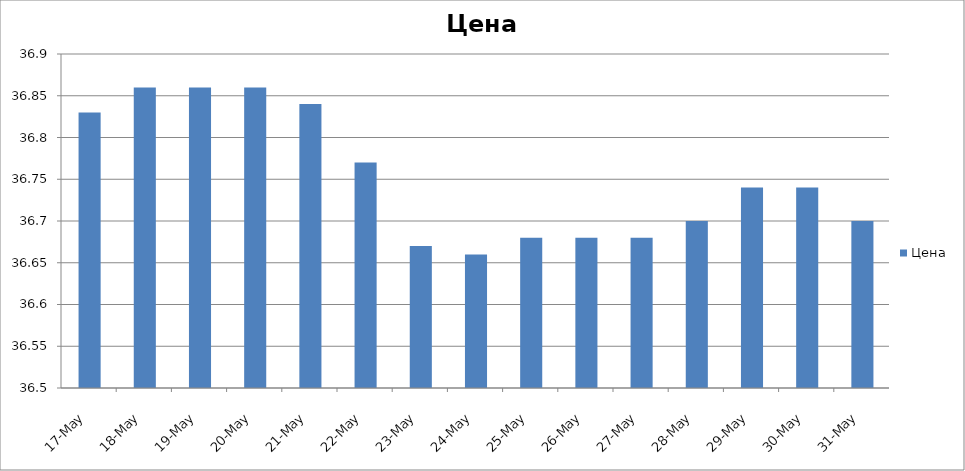
| Category | Цена |
|---|---|
| 2018-05-17 | 36.83 |
| 2018-05-18 | 36.86 |
| 2018-05-19 | 36.86 |
| 2018-05-20 | 36.86 |
| 2018-05-21 | 36.84 |
| 2018-05-22 | 36.77 |
| 2018-05-23 | 36.67 |
| 2018-05-24 | 36.66 |
| 2018-05-25 | 36.68 |
| 2018-05-26 | 36.68 |
| 2018-05-27 | 36.68 |
| 2018-05-28 | 36.7 |
| 2018-05-29 | 36.74 |
| 2018-05-30 | 36.74 |
| 2018-05-31 | 36.7 |